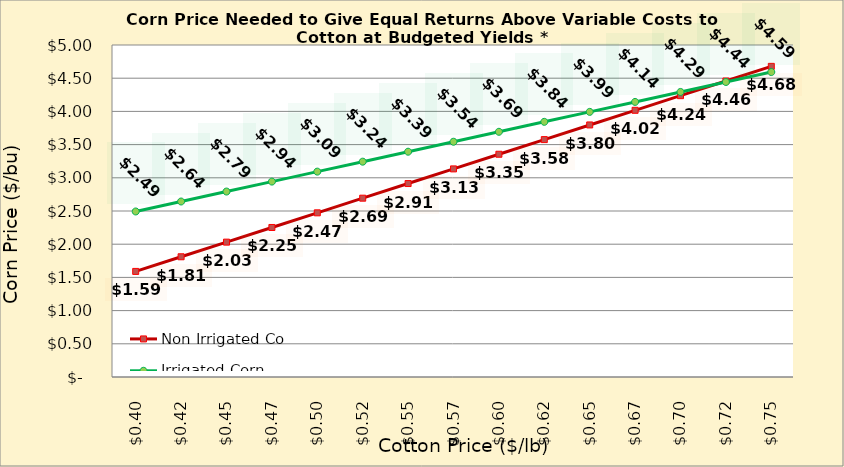
| Category | Non Irrigated Corn | Irrigated Corn |
|---|---|---|
| 0.3949999999999998 | 1.59 | 2.493 |
| 0.4199999999999998 | 1.811 | 2.643 |
| 0.44499999999999984 | 2.031 | 2.793 |
| 0.46999999999999986 | 2.252 | 2.943 |
| 0.4949999999999999 | 2.472 | 3.093 |
| 0.5199999999999999 | 2.693 | 3.243 |
| 0.5449999999999999 | 2.914 | 3.393 |
| 0.57 | 3.134 | 3.543 |
| 0.595 | 3.355 | 3.693 |
| 0.62 | 3.575 | 3.843 |
| 0.645 | 3.796 | 3.993 |
| 0.67 | 4.017 | 4.143 |
| 0.6950000000000001 | 4.237 | 4.293 |
| 0.7200000000000001 | 4.458 | 4.443 |
| 0.7450000000000001 | 4.678 | 4.593 |